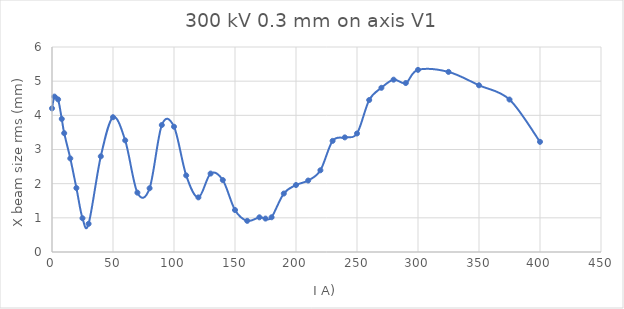
| Category | Series 0 |
|---|---|
| 0.0 | 4.204 |
| 2.0 | 4.548 |
| 5.0 | 4.466 |
| 8.0 | 3.895 |
| 10.0 | 3.478 |
| 15.0 | 2.738 |
| 20.0 | 1.873 |
| 25.0 | 0.988 |
| 30.0 | 0.825 |
| 40.0 | 2.8 |
| 50.0 | 3.944 |
| 60.0 | 3.267 |
| 70.0 | 1.737 |
| 80.0 | 1.866 |
| 90.0 | 3.716 |
| 100.0 | 3.667 |
| 110.0 | 2.24 |
| 120.0 | 1.598 |
| 130.0 | 2.296 |
| 140.0 | 2.106 |
| 150.0 | 1.229 |
| 160.0 | 0.912 |
| 170.0 | 1.015 |
| 175.0 | 0.978 |
| 180.0 | 1.017 |
| 190.0 | 1.711 |
| 200.0 | 1.96 |
| 210.0 | 2.092 |
| 220.0 | 2.392 |
| 230.0 | 3.252 |
| 240.0 | 3.354 |
| 250.0 | 3.469 |
| 260.0 | 4.448 |
| 270.0 | 4.806 |
| 280.0 | 5.044 |
| 290.0 | 4.945 |
| 300.0 | 5.331 |
| 325.0 | 5.271 |
| 350.0 | 4.879 |
| 375.0 | 4.462 |
| 400.0 | 3.224 |